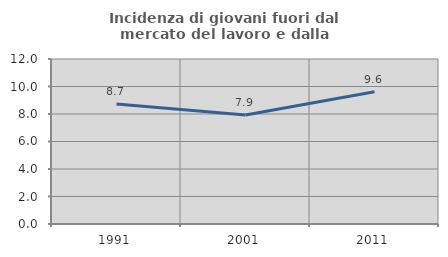
| Category | Incidenza di giovani fuori dal mercato del lavoro e dalla formazione  |
|---|---|
| 1991.0 | 8.724 |
| 2001.0 | 7.931 |
| 2011.0 | 9.615 |